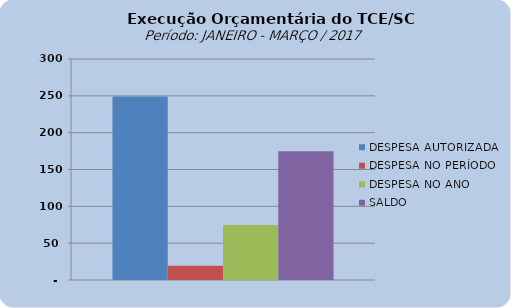
| Category | DESPESA AUTORIZADA | DESPESA NO PERÍODO | DESPESA NO ANO | SALDO |
|---|---|---|---|---|
| 0 | 249151563.63 | 19377844.77 | 74523399.06 | 174628164.57 |